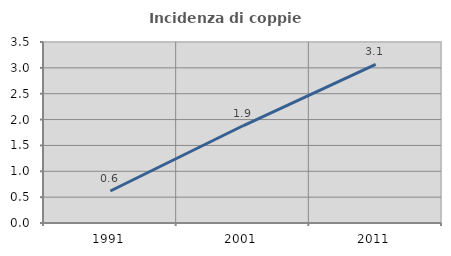
| Category | Incidenza di coppie miste |
|---|---|
| 1991.0 | 0.619 |
| 2001.0 | 1.88 |
| 2011.0 | 3.068 |